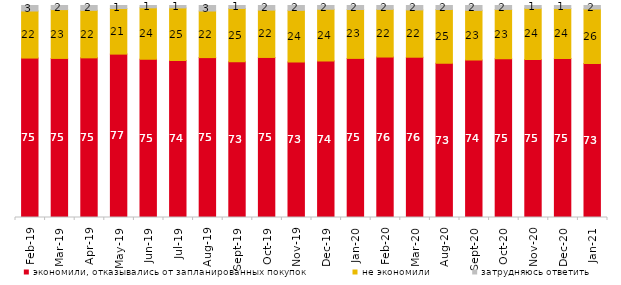
| Category | экономили, отказывались от запланированных покупок | не экономили | затрудняюсь ответить |
|---|---|---|---|
| 2019-02-01 | 75.2 | 22.2 | 2.6 |
| 2019-03-01 | 75.037 | 23.023 | 1.939 |
| 2019-04-01 | 75.297 | 22.426 | 2.277 |
| 2019-05-01 | 77.068 | 21.496 | 1.436 |
| 2019-06-01 | 74.663 | 24.239 | 1.097 |
| 2019-07-01 | 74.109 | 24.752 | 1.139 |
| 2019-08-01 | 75.425 | 21.978 | 2.597 |
| 2019-09-01 | 73.465 | 25.149 | 1.386 |
| 2019-10-01 | 75.495 | 22.327 | 2.178 |
| 2019-11-01 | 73.366 | 24.356 | 2.277 |
| 2019-12-01 | 73.861 | 24.356 | 1.782 |
| 2020-01-01 | 75.05 | 23.069 | 1.881 |
| 2020-02-01 | 75.693 | 22.475 | 1.832 |
| 2020-03-01 | 75.607 | 22.31 | 2.082 |
| 2020-08-01 | 72.79 | 25.323 | 1.887 |
| 2020-09-01 | 74.316 | 23.395 | 2.29 |
| 2020-10-01 | 74.838 | 23.318 | 1.844 |
| 2020-11-01 | 74.55 | 24.1 | 1.35 |
| 2020-12-01 | 74.963 | 23.649 | 1.388 |
| 2021-01-01 | 72.678 | 25.683 | 1.639 |